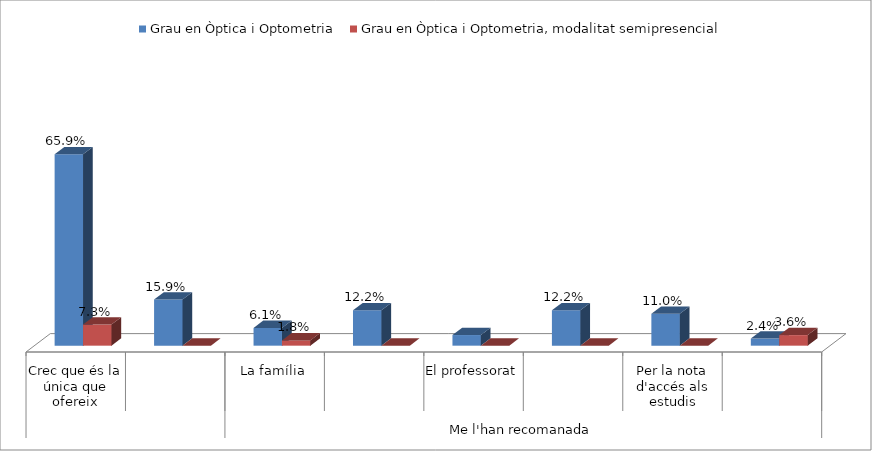
| Category | Grau en Òptica i Optometria | Grau en Òptica i Optometria, modalitat semipresencial |
|---|---|---|
| 0 | 0.659 | 0.073 |
| 1 | 0.159 | 0 |
| 2 | 0.061 | 0.018 |
| 3 | 0.122 | 0 |
| 4 | 0.037 | 0 |
| 5 | 0.122 | 0 |
| 6 | 0.11 | 0 |
| 7 | 0.024 | 0.036 |